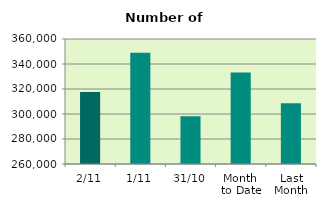
| Category | Series 0 |
|---|---|
| 2/11 | 317576 |
| 1/11 | 348902 |
| 31/10 | 298140 |
| Month 
to Date | 333239 |
| Last
Month | 308508.19 |